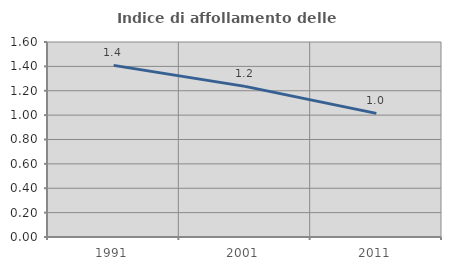
| Category | Indice di affollamento delle abitazioni  |
|---|---|
| 1991.0 | 1.408 |
| 2001.0 | 1.236 |
| 2011.0 | 1.014 |